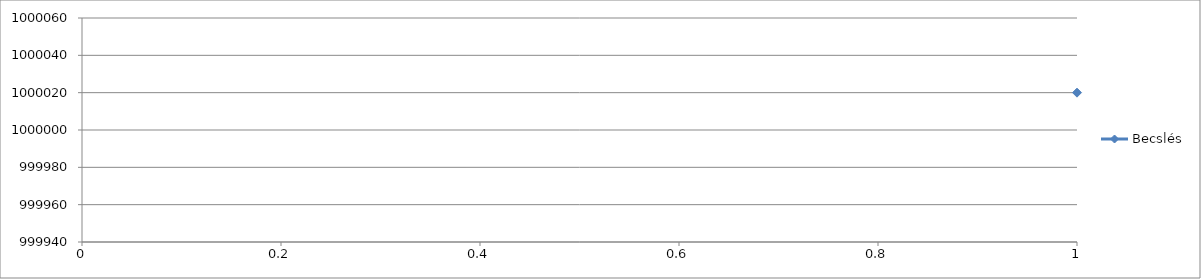
| Category | Becslés |
|---|---|
| 0 | 1000020 |
| 1 | 1000020.5 |
| 2 | 1000018.5 |
| 3 | 1000016.5 |
| 4 | 1000015 |
| 5 | 1000010 |
| 6 | 1000027 |
| 7 | 999991.5 |
| 8 | 1000024 |
| 9 | 1000021 |
| 10 | 1000018 |
| 11 | 999995.5 |
| 12 | 1000022.5 |
| 13 | 999998 |
| 14 | 999990.5 |
| 15 | 999984 |
| 16 | 1000013.5 |
| 17 | 1000012 |
| 18 | 1000005 |
| 19 | 1000015 |
| 20 | 999982 |
| 21 | 999967 |
| 22 | 999972 |
| 23 | 999976 |
| 24 | 999987.5 |
| 25 | 999987 |
| 26 | 999985.5 |
| 27 | 1000021.5 |
| 28 | 1000016.5 |
| 29 | 1000010.5 |
| 30 | 999996.5 |
| 31 | 999985 |
| 32 | 999970.5 |
| 33 | 999980 |
| 34 | 999964.5 |
| 35 | 1000003.5 |
| 36 | 1000002.5 |
| 37 | 1000019 |
| 38 | 1000005 |
| 39 | 1000005 |
| 40 | 1000004 |
| 41 | 1000002 |
| 42 | 999989 |
| 43 | 999974 |
| 44 | 999966.5 |
| 45 | 999985 |
| 46 | 999970.5 |
| 47 | 999991 |
| 48 | 1000003.5 |
| 49 | 1000005 |
| 50 | 1000015.5 |
| 51 | 1000010 |
| 52 | 999978.5 |
| 53 | 999966.5 |
| 54 | 999968 |
| 55 | 999977.5 |
| 56 | 999954.5 |
| 57 | 1000010.5 |
| 58 | 1000035 |
| 59 | 1000046.5 |
| 60 | 1000014.5 |
| 61 | 1000043 |
| 62 | 999979.5 |
| 63 | 999967 |
| 64 | 999989.5 |
| 65 | 999970.5 |
| 66 | 999976.5 |
| 67 | 999986 |
| 68 | 999987 |
| 69 | 1000037.5 |
| 70 | 1000008.5 |
| 71 | 1000021 |
| 72 | 1000021.5 |
| 73 | 999972 |
| 74 | 1000017 |
| 75 | 1000005.5 |
| 76 | 999999 |
| 77 | 1000016 |
| 78 | 999992.5 |
| 79 | 1000026.5 |
| 80 | 1000003.5 |
| 81 | 1000019 |
| 82 | 1000008.5 |
| 83 | 1000011.5 |
| 84 | 999996 |
| 85 | 1000022 |
| 86 | 1000012 |
| 87 | 1000016.5 |
| 88 | 999974.5 |
| 89 | 1000003 |
| 90 | 1000020.5 |
| 91 | 999999.5 |
| 92 | 1000004 |
| 93 | 1000009 |
| 94 | 999979 |
| 95 | 999997.5 |
| 96 | 999974.5 |
| 97 | 1000008 |
| 98 | 999986.5 |
| 99 | 1000016 |